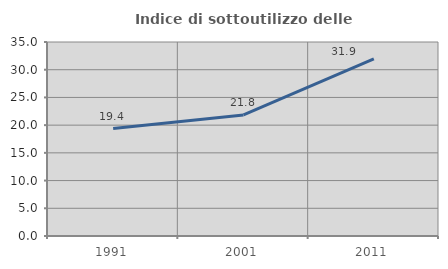
| Category | Indice di sottoutilizzo delle abitazioni  |
|---|---|
| 1991.0 | 19.375 |
| 2001.0 | 21.839 |
| 2011.0 | 31.94 |